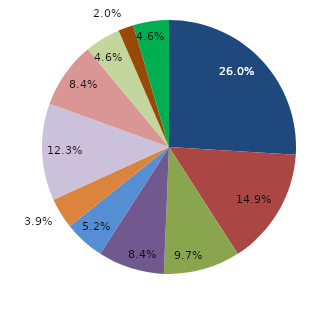
| Category | Series 0 |
|---|---|
| قبل الدخول | 25.974 |
| -1 | 14.935 |
| 1 | 9.74 |
| 2 | 8.442 |
| 3 | 5.195 |
| 4 | 3.896 |
|  5 - 9 | 12.338 |
|  10 - 14 | 8.442 |
|  15 - 19 | 4.545 |
|  20 - 24 | 1.948 |
| 25 + | 4.545 |